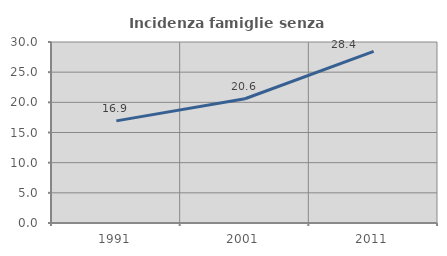
| Category | Incidenza famiglie senza nuclei |
|---|---|
| 1991.0 | 16.926 |
| 2001.0 | 20.599 |
| 2011.0 | 28.444 |